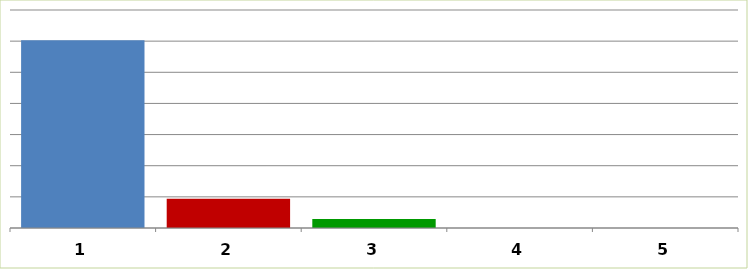
| Category | Series 0 |
|---|---|
| 0 | 60320380.7 |
| 1 | 9407643 |
| 2 | 2876005 |
| 3 | 0 |
| 4 | 0 |